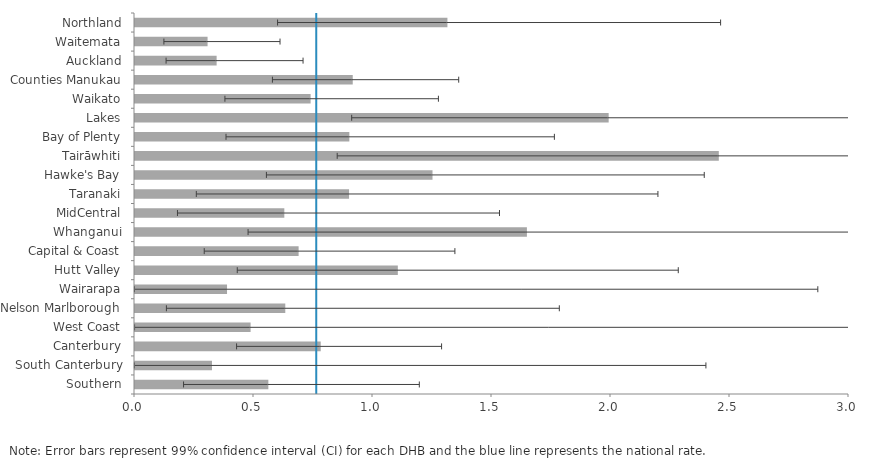
| Category | DHB |
|---|---|
| Northland | 1.313 |
| Waitemata | 0.305 |
| Auckland | 0.343 |
| Counties Manukau | 0.915 |
| Waikato | 0.738 |
| Lakes | 1.99 |
| Bay of Plenty | 0.901 |
| Tairāwhiti | 2.453 |
| Hawke's Bay | 1.25 |
| Taranaki | 0.899 |
| MidCentral | 0.627 |
| Whanganui | 1.647 |
| Capital & Coast | 0.687 |
| Hutt Valley | 1.104 |
| Wairarapa | 0.387 |
| Nelson Marlborough | 0.631 |
| West Coast | 0.486 |
| Canterbury | 0.78 |
| South Canterbury | 0.323 |
| Southern | 0.56 |